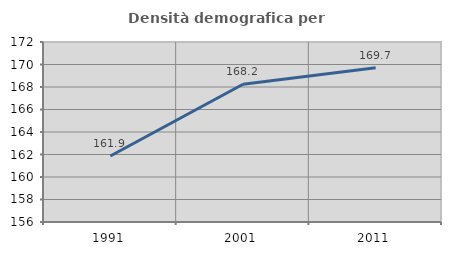
| Category | Densità demografica |
|---|---|
| 1991.0 | 161.868 |
| 2001.0 | 168.244 |
| 2011.0 | 169.716 |